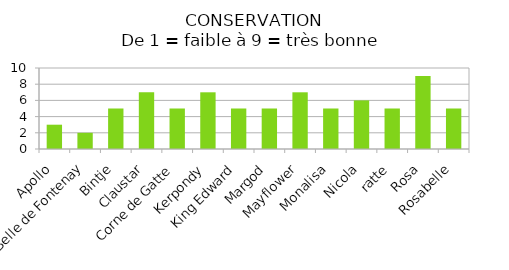
| Category | conservation |
|---|---|
| Apollo | 3 |
| Belle de Fontenay | 2 |
| Bintje | 5 |
| Claustar | 7 |
| Corne de Gatte | 5 |
| Kerpondy | 7 |
| King Edward | 5 |
| Margod  | 5 |
| Mayflower  | 7 |
| Monalisa | 5 |
| Nicola | 6 |
| ratte | 5 |
| Rosa | 9 |
| Rosabelle | 5 |